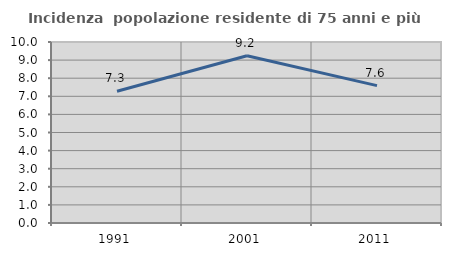
| Category | Incidenza  popolazione residente di 75 anni e più |
|---|---|
| 1991.0 | 7.28 |
| 2001.0 | 9.237 |
| 2011.0 | 7.589 |